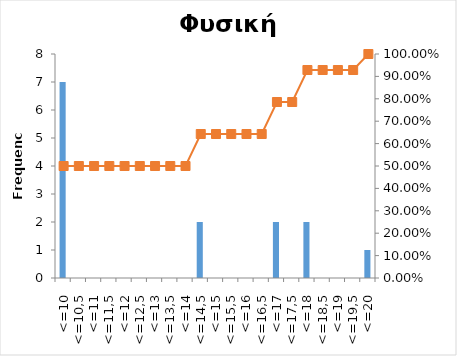
| Category | Series 0 |
|---|---|
| <=10 | 7 |
| <=10,5 | 0 |
| <=11 | 0 |
| <=11,5 | 0 |
| <=12 | 0 |
| <=12,5 | 0 |
| <=13 | 0 |
| <=13,5 | 0 |
| <=14 | 0 |
| <=14,5 | 2 |
| <=15 | 0 |
| <=15,5 | 0 |
| <=16 | 0 |
| <=16,5 | 0 |
| <=17 | 2 |
| <=17,5 | 0 |
| <=18 | 2 |
| <=18,5 | 0 |
| <=19 | 0 |
| <=19,5 | 0 |
| <=20 | 1 |